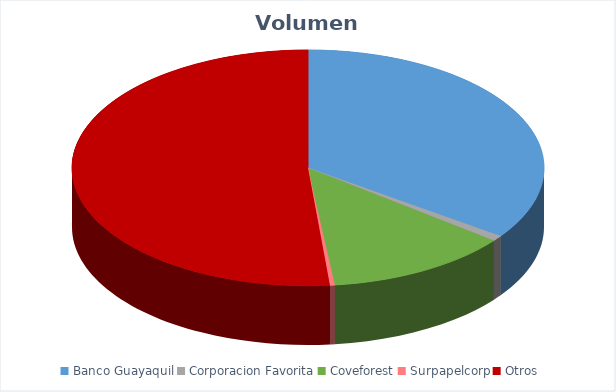
| Category | VOLUMEN ($USD) |
|---|---|
| Banco Guayaquil | 44560 |
| Corporacion Favorita | 1000 |
| Coveforest | 16120 |
| Surpapelcorp | 425 |
| Otros | 65900 |